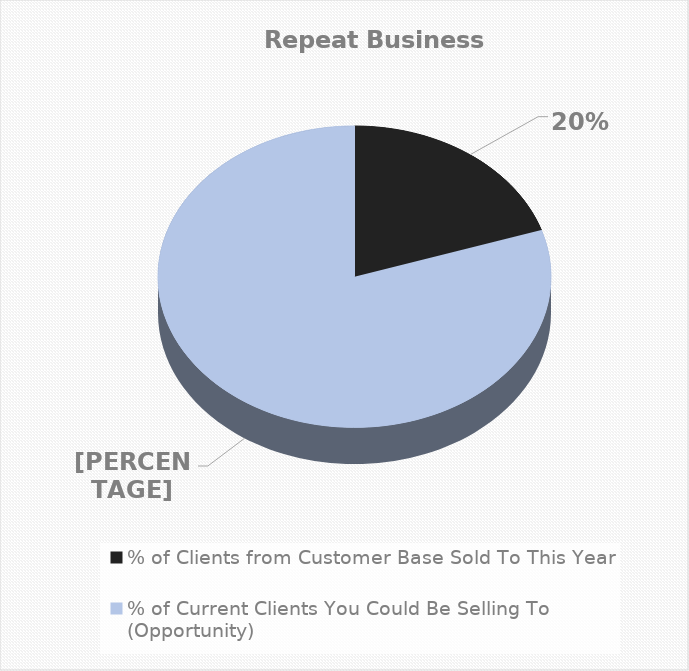
| Category | Series 0 |
|---|---|
| % of Clients from Customer Base Sold To This Year | 0.2 |
| % of Current Clients You Could Be Selling To (Opportunity) | 0.8 |